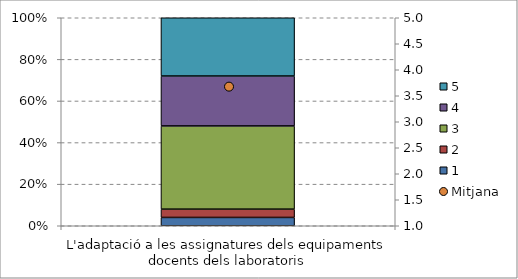
| Category | 1 | 2 | 3 | 4 | 5 |
|---|---|---|---|---|---|
| L'adaptació a les assignatures dels equipaments docents dels laboratoris | 0.04 | 0.04 | 0.4 | 0.24 | 0.28 |